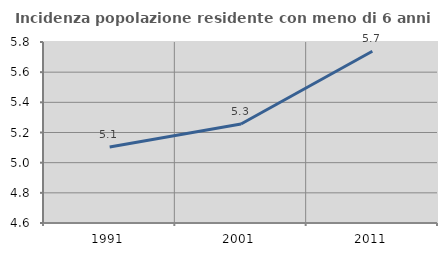
| Category | Incidenza popolazione residente con meno di 6 anni |
|---|---|
| 1991.0 | 5.103 |
| 2001.0 | 5.257 |
| 2011.0 | 5.739 |